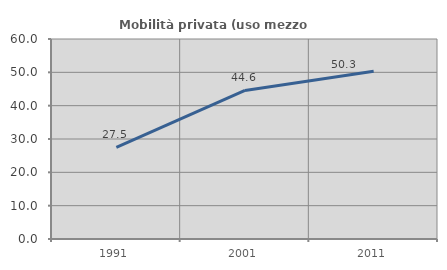
| Category | Mobilità privata (uso mezzo privato) |
|---|---|
| 1991.0 | 27.515 |
| 2001.0 | 44.554 |
| 2011.0 | 50.332 |